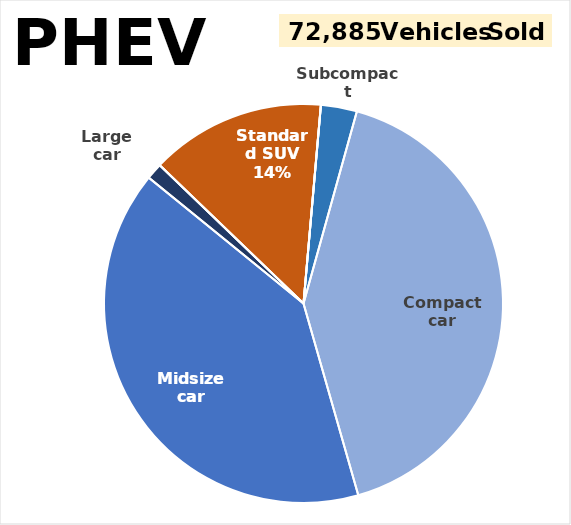
| Category | PHEV Sales Shares by Vehicle Type and Size Class |
|---|---|
| Two seater | 0 |
| Minicompact car | 0 |
| Subcompact | 0.029 |
| Compact car | 0.413 |
| Midsize car | 0.403 |
| Large car | 0.013 |
| Station Wagon | 0 |
| Standard SUV | 0.142 |